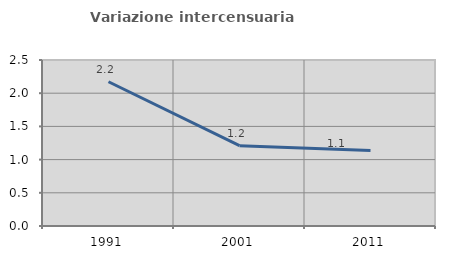
| Category | Variazione intercensuaria annua |
|---|---|
| 1991.0 | 2.173 |
| 2001.0 | 1.209 |
| 2011.0 | 1.135 |